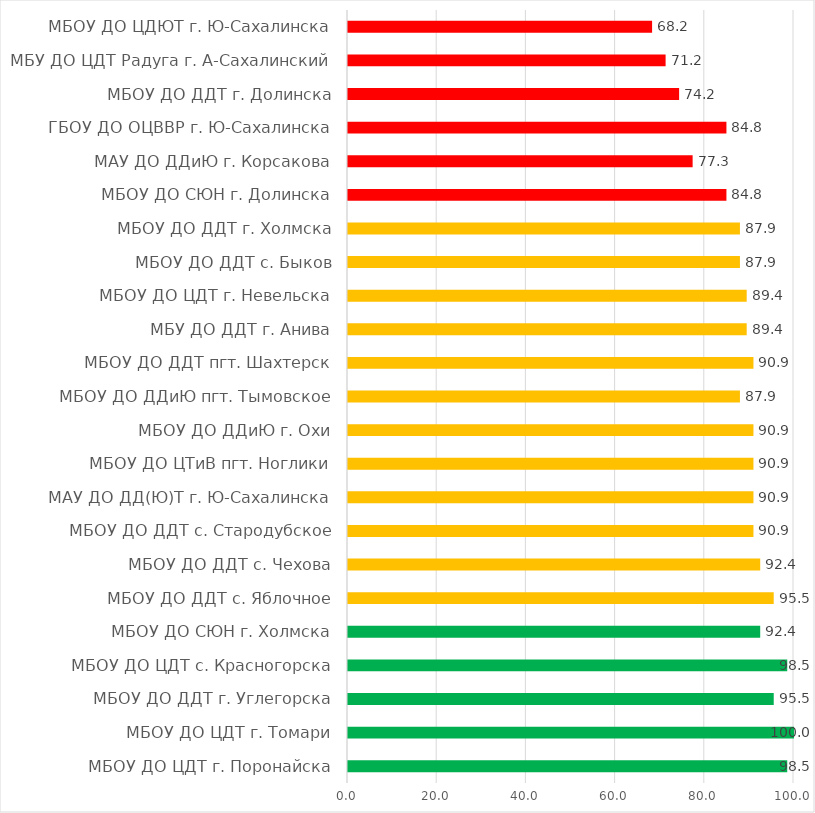
| Category | Series 0 |
|---|---|
| МБОУ ДО ЦДТ г. Поронайска | 98.485 |
| МБОУ ДО ЦДТ г. Томари | 100 |
| МБОУ ДО ДДТ г. Углегорска | 95.455 |
| МБОУ ДО ЦДТ с. Красногорска | 98.485 |
| МБОУ ДО СЮН г. Холмска | 92.424 |
| МБОУ ДО ДДТ с. Яблочное | 95.455 |
| МБОУ ДО ДДТ с. Чехова | 92.424 |
| МБОУ ДО ДДТ с. Стародубское | 90.909 |
| МАУ ДО ДД(Ю)Т г. Ю-Сахалинска | 90.909 |
| МБОУ ДО ЦТиВ пгт. Ноглики | 90.909 |
| МБОУ ДО ДДиЮ г. Охи | 90.909 |
| МБОУ ДО ДДиЮ пгт. Тымовское | 87.879 |
| МБОУ ДО ДДТ пгт. Шахтерск | 90.909 |
| МБУ ДО ДДТ г. Анива | 89.394 |
| МБОУ ДО ЦДТ г. Невельска | 89.394 |
| МБОУ ДО ДДТ с. Быков | 87.879 |
| МБОУ ДО ДДТ г. Холмска | 87.879 |
| МБОУ ДО СЮН г. Долинска | 84.848 |
| МАУ ДО ДДиЮ г. Корсакова | 77.273 |
| ГБОУ ДО ОЦВВР г. Ю-Сахалинска | 84.848 |
| МБОУ ДО ДДТ г. Долинска | 74.242 |
| МБУ ДО ЦДТ Радуга г. А-Сахалинский | 71.212 |
| МБОУ ДО ЦДЮТ г. Ю-Сахалинска | 68.182 |